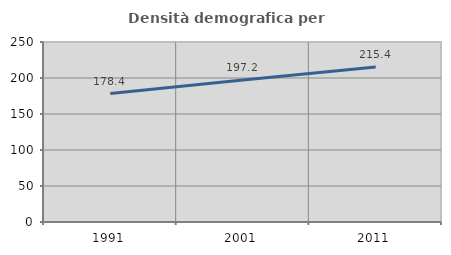
| Category | Densità demografica |
|---|---|
| 1991.0 | 178.371 |
| 2001.0 | 197.168 |
| 2011.0 | 215.394 |